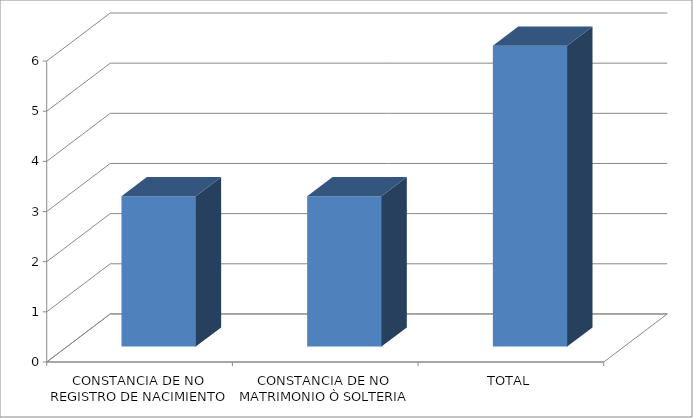
| Category | Series 0 |
|---|---|
| CONSTANCIA DE NO REGISTRO DE NACIMIENTO | 3 |
| CONSTANCIA DE NO MATRIMONIO Ò SOLTERIA | 3 |
| TOTAL | 6 |